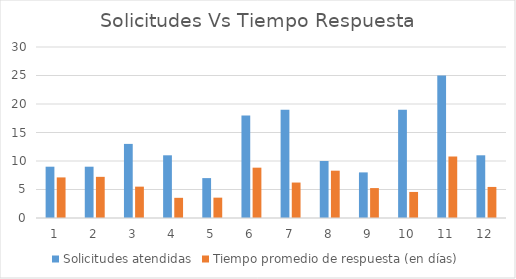
| Category | Solicitudes atendidas | Tiempo promedio de respuesta (en días) |
|---|---|---|
| 0 | 9 | 7.12 |
| 1 | 9 | 7.22 |
| 2 | 13 | 5.5 |
| 3 | 11 | 3.54 |
| 4 | 7 | 3.57 |
| 5 | 18 | 8.83 |
| 6 | 19 | 6.22 |
| 7 | 10 | 8.3 |
| 8 | 8 | 5.25 |
| 9 | 19 | 4.57 |
| 10 | 25 | 10.79 |
| 11 | 11 | 5.45 |